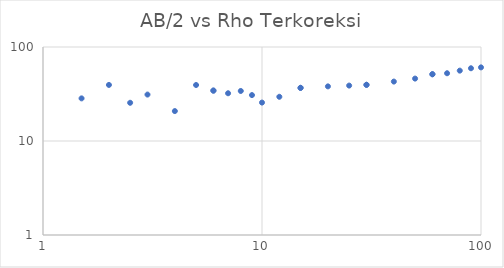
| Category | Series 0 |
|---|---|
| 1.5 | 28.412 |
| 2.0 | 39.497 |
| 2.5 | 25.499 |
| 3.0 | 31.185 |
| 4.0 | 20.81 |
| 5.0 | 39.416 |
| 6.0 | 34.371 |
| 6.0 | 34.371 |
| 7.0 | 32.202 |
| 8.0 | 34.057 |
| 9.0 | 30.788 |
| 10.0 | 25.634 |
| 12.0 | 29.54 |
| 15.0 | 36.769 |
| 15.0 | 36.769 |
| 20.0 | 38.12 |
| 25.0 | 38.863 |
| 30.0 | 39.622 |
| 30.0 | 39.622 |
| 40.0 | 42.874 |
| 50.0 | 46.121 |
| 60.0 | 51.305 |
| 60.0 | 51.305 |
| 70.0 | 52.585 |
| 80.0 | 56.033 |
| 90.0 | 59.409 |
| 100.0 | 60.702 |